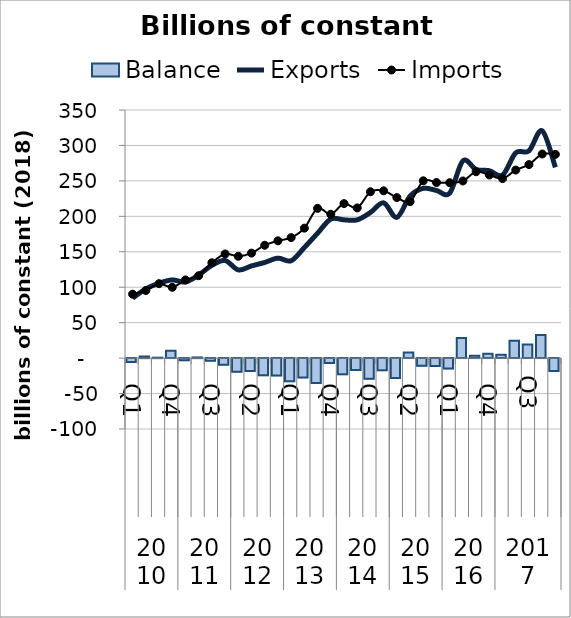
| Category | Balance |
|---|---|
| 0 | -5.571 |
| 1 | 2.285 |
| 2 | 0.651 |
| 3 | 10.442 |
| 4 | -2.941 |
| 5 | 0.969 |
| 6 | -3.62 |
| 7 | -9.216 |
| 8 | -19.215 |
| 9 | -18.06 |
| 10 | -24.272 |
| 11 | -24.43 |
| 12 | -32.665 |
| 13 | -27.314 |
| 14 | -35.045 |
| 15 | -6.8 |
| 16 | -22.888 |
| 17 | -16.833 |
| 18 | -29.227 |
| 19 | -17.031 |
| 20 | -27.9 |
| 21 | 7.779 |
| 22 | -10.654 |
| 23 | -11.198 |
| 24 | -14.72 |
| 25 | 28.39 |
| 26 | 3.187 |
| 27 | 6.072 |
| 28 | 4.81 |
| 29 | 24.316 |
| 30 | 19.37 |
| 31 | 32.698 |
| 32 | -18.252 |